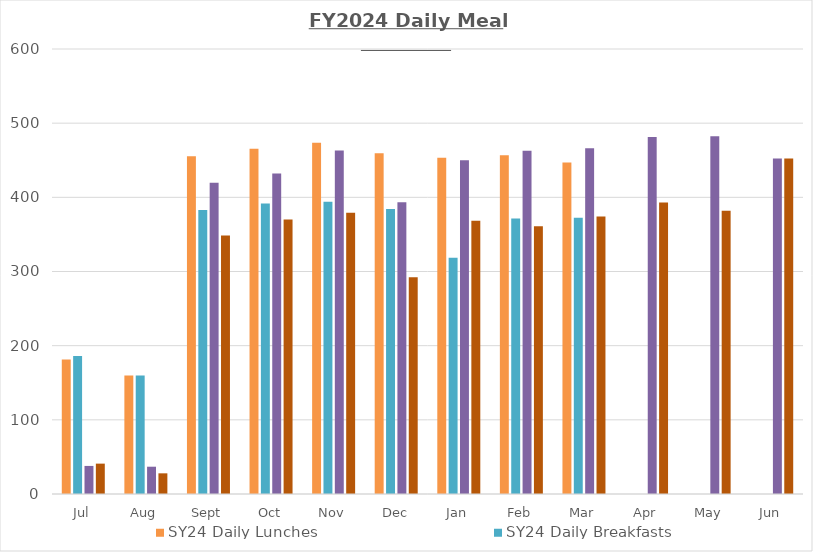
| Category | SY24 Daily Lunches | SY24 Daily Breakfasts | SY23 Daily Lunches | SY23 Daily Breakfasts |
|---|---|---|---|---|
| Jul | 181.207 | 186.207 | 37.85 | 40.95 |
| Aug | 159.882 | 159.647 | 36.8 | 27.867 |
| Sept | 455.35 | 382.8 | 419.636 | 348.682 |
| Oct | 465.476 | 391.524 | 432.05 | 370 |
| Nov | 473.722 | 394.111 | 463.278 | 379.056 |
| Dec | 459.5 | 384.312 | 393.294 | 292.235 |
| Jan | 453.35 | 318.5 | 450 | 368.263 |
| Feb | 456.889 | 371.611 | 462.824 | 361.059 |
| Mar | 446.895 | 372.632 | 466.25 | 374.25 |
| Apr | 0 | 0 | 481.357 | 393.071 |
| May | 0 | 0 | 482.364 | 382 |
| Jun | 0 | 0 | 452.385 | 452.385 |